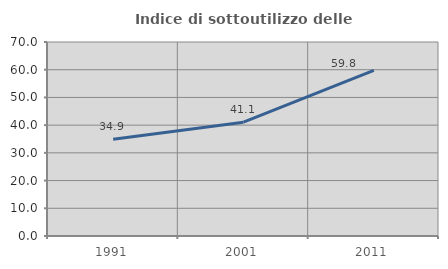
| Category | Indice di sottoutilizzo delle abitazioni  |
|---|---|
| 1991.0 | 34.884 |
| 2001.0 | 41.053 |
| 2011.0 | 59.783 |